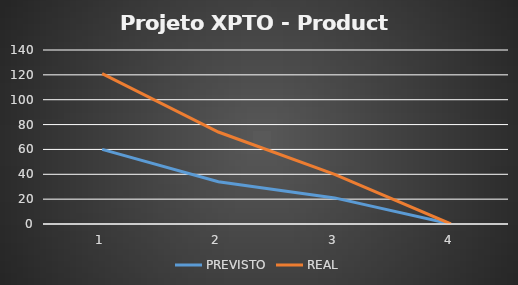
| Category | PREVISTO | REAL |
|---|---|---|
| 0 | 60 | 61 |
| 1 | 34 | 40 |
| 2 | 21 | 19 |
| 3 | 0 | 0 |